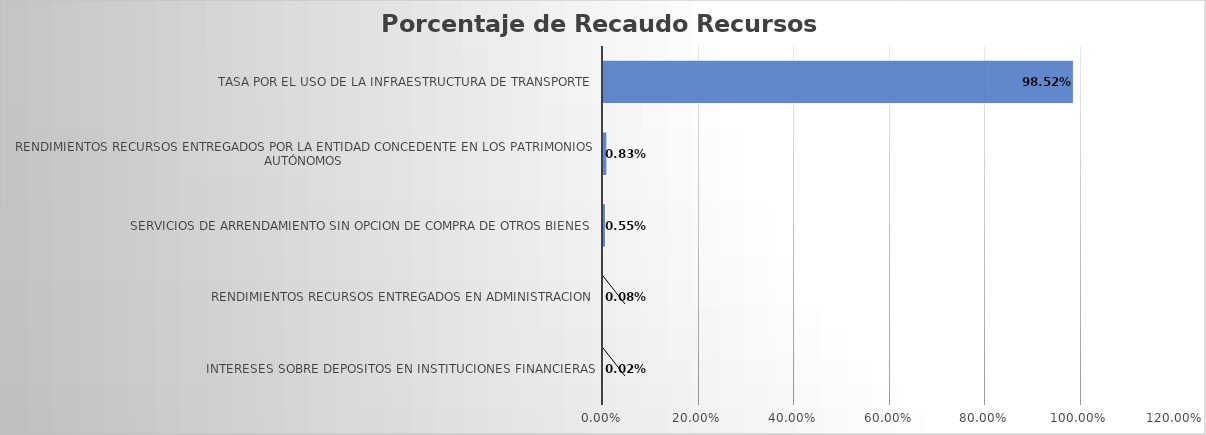
| Category | Total |
|---|---|
| INTERESES SOBRE DEPOSITOS EN INSTITUCIONES FINANCIERAS | 0 |
| RENDIMIENTOS RECURSOS ENTREGADOS EN ADMINISTRACION | 0.001 |
| SERVICIOS DE ARRENDAMIENTO SIN OPCION DE COMPRA DE OTROS BIENES | 0.006 |
| RENDIMIENTOS RECURSOS ENTREGADOS POR LA ENTIDAD CONCEDENTE EN LOS PATRIMONIOS AUTÓNOMOS | 0.008 |
| TASA POR EL USO DE LA INFRAESTRUCTURA DE TRANSPORTE | 0.985 |